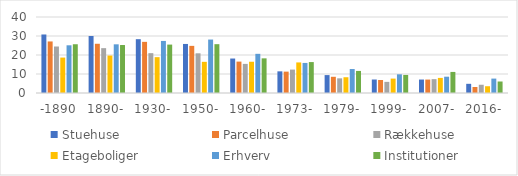
| Category | Stuehuse | Parcelhuse | Rækkehuse | Etageboliger | Erhverv | Institutioner |
|---|---|---|---|---|---|---|
| -1890 | 30.801 | 27.131 | 24.472 | 18.646 | 25.106 | 25.66 |
| 1890- | 29.998 | 25.911 | 23.606 | 19.711 | 25.624 | 25.249 |
| 1930- | 28.323 | 26.921 | 20.973 | 18.859 | 27.401 | 25.48 |
| 1950- | 25.811 | 24.804 | 20.894 | 16.408 | 28.133 | 25.7 |
| 1960- | 18.144 | 16.525 | 15.32 | 16.452 | 20.617 | 18.236 |
| 1973- | 11.399 | 11.248 | 12.324 | 16.093 | 15.823 | 16.278 |
| 1979- | 9.428 | 8.531 | 7.719 | 8.297 | 12.613 | 11.613 |
| 1999- | 7.099 | 6.844 | 5.86 | 7.58 | 9.836 | 9.507 |
| 2007- | 7.083 | 7.075 | 7.293 | 7.942 | 8.582 | 11.089 |
| 2016- | 4.834 | 3.169 | 4.346 | 3.558 | 7.584 | 6.053 |